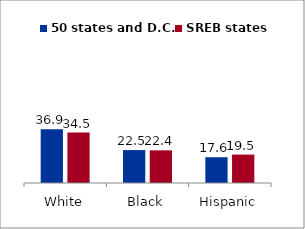
| Category | 50 states and D.C. | SREB states |
|---|---|---|
| White | 36.866 | 34.534 |
| Black | 22.545 | 22.359 |
| Hispanic | 17.637 | 19.471 |